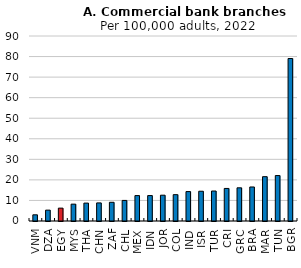
| Category | Number of commercial bank branches per 100,000 adults, 2022 |
|---|---|
| VNM | 3.01 |
| DZA | 5.29 |
| EGY | 6.26 |
| MYS | 8.2 |
| THA | 8.71 |
| CHN | 8.8 |
| ZAF | 9.1 |
| CHL | 10.01 |
| MEX | 12.36 |
| IDN | 12.37 |
| JOR | 12.55 |
| COL | 12.81 |
| IND | 14.31 |
| ISR | 14.48 |
| TUR | 14.58 |
| CRI | 15.84 |
| GRC | 16.14 |
| BRA | 16.55 |
| MAR | 21.56 |
| TUN | 22.11 |
| BGR | 79.04 |